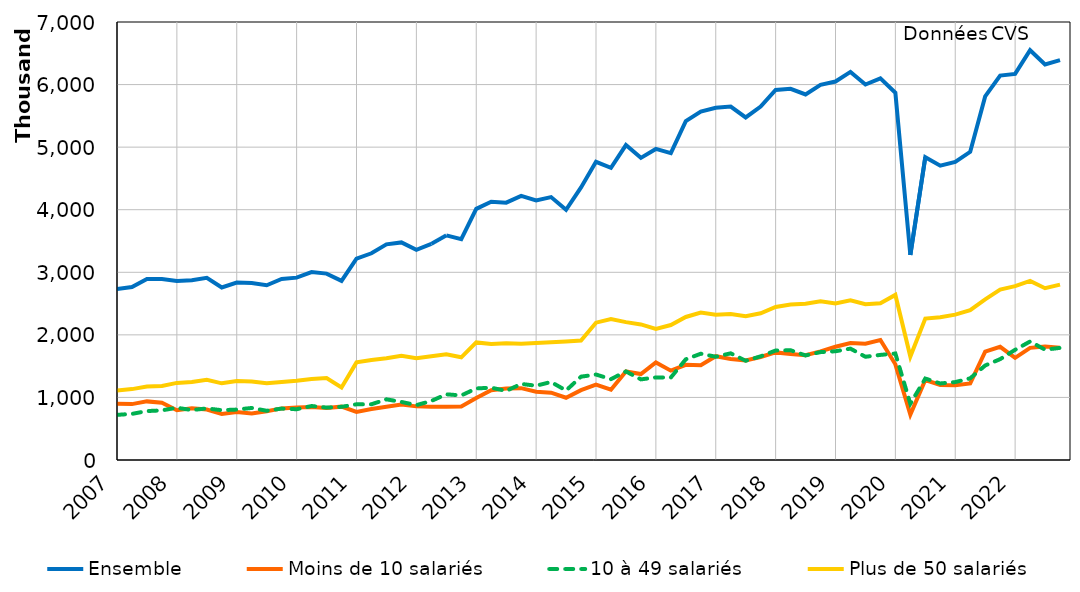
| Category | Ensemble | Moins de 10 salariés | 10 à 49 salariés | Plus de 50 salariés |
|---|---|---|---|---|
| 2007-01-01 | 2732173 | 899910 | 721403 | 1110859 |
| 2007-04-01 | 2763568 | 893427 | 737051 | 1133090 |
| 2007-07-01 | 2892276 | 936686 | 781789 | 1173800 |
| 2007-10-01 | 2892066 | 915352 | 793323 | 1183391 |
| 2008-01-01 | 2862612 | 795141 | 835026 | 1232445 |
| 2008-04-01 | 2871384 | 826577 | 798074 | 1246733 |
| 2008-07-01 | 2912470 | 805627 | 824195 | 1282648 |
| 2008-10-01 | 2757917 | 736533 | 796007 | 1225377 |
| 2009-01-01 | 2834828 | 766598 | 806085 | 1262144 |
| 2009-04-01 | 2828780 | 743368 | 831855 | 1253557 |
| 2009-07-01 | 2792769 | 780034 | 786946 | 1225789 |
| 2009-10-01 | 2894340 | 824590 | 821611 | 1248139 |
| 2010-01-01 | 2914322 | 837217 | 811510 | 1265595 |
| 2010-04-01 | 3002741 | 846842 | 862668 | 1293231 |
| 2010-07-01 | 2978815 | 832173 | 837594 | 1309047 |
| 2010-10-01 | 2862588 | 852887 | 850040 | 1159661 |
| 2011-01-01 | 3218928 | 768588 | 890356 | 1559984 |
| 2011-04-01 | 3303790 | 813590 | 890554 | 1599646 |
| 2011-07-01 | 3447120 | 852443 | 969723 | 1624954 |
| 2011-10-01 | 3477615 | 885080 | 928043 | 1664492 |
| 2012-01-01 | 3358972 | 856984 | 876964 | 1625024 |
| 2012-04-01 | 3454054 | 852094 | 943933 | 1658027 |
| 2012-07-01 | 3590505 | 850554 | 1050081 | 1689870 |
| 2012-10-01 | 3528094 | 855264 | 1031404 | 1641426 |
| 2013-01-01 | 4013410 | 990559 | 1143377 | 1879474 |
| 2013-04-01 | 4126765 | 1115842 | 1155878 | 1855045 |
| 2013-07-01 | 4112420 | 1142009 | 1104196 | 1866214 |
| 2013-10-01 | 4221286 | 1147868 | 1215757 | 1857662 |
| 2014-01-01 | 4147546 | 1091200 | 1187499 | 1868848 |
| 2014-04-01 | 4202389 | 1075541 | 1246668 | 1880180 |
| 2014-07-01 | 3997805 | 994688 | 1110521 | 1892595 |
| 2014-10-01 | 4355377 | 1115521 | 1331903 | 1907954 |
| 2015-01-01 | 4765850 | 1205200 | 1365923 | 2194727 |
| 2015-04-01 | 4668917 | 1122794 | 1292168 | 2253954 |
| 2015-07-01 | 5033625 | 1415241 | 1415089 | 2203295 |
| 2015-10-01 | 4828947 | 1373908 | 1288626 | 2166413 |
| 2016-01-01 | 4971504 | 1558587 | 1319190 | 2093727 |
| 2016-04-01 | 4904024 | 1428259 | 1318646 | 2157119 |
| 2016-07-01 | 5416817 | 1521743 | 1609353 | 2285721 |
| 2016-10-01 | 5569017 | 1514223 | 1698397 | 2356397 |
| 2017-01-01 | 5630427 | 1659057 | 1650711 | 2320658 |
| 2017-04-01 | 5649164 | 1612995 | 1704672 | 2331498 |
| 2017-07-01 | 5475133 | 1592363 | 1585765 | 2297005 |
| 2017-10-01 | 5648385 | 1646854 | 1656781 | 2344750 |
| 2018-01-01 | 5914472 | 1719616 | 1749878 | 2444977 |
| 2018-04-01 | 5931845 | 1693967 | 1753571 | 2484306 |
| 2018-07-01 | 5841588 | 1673973 | 1671152 | 2496463 |
| 2018-10-01 | 5996247 | 1735785 | 1724277 | 2536184 |
| 2019-01-01 | 6048424 | 1810472 | 1737956 | 2499995 |
| 2019-04-01 | 6202747 | 1870092 | 1779682 | 2552973 |
| 2019-07-01 | 6000425 | 1859597 | 1649940 | 2490889 |
| 2019-10-01 | 6099987 | 1916946 | 1679613 | 2503428 |
| 2020-01-01 | 5869712 | 1529147 | 1702077 | 2638488 |
| 2020-04-01 | 3277372 | 724621 | 899107 | 1653644 |
| 2020-07-01 | 4840222 | 1278460 | 1301686 | 2260075 |
| 2020-10-01 | 4704570 | 1200470 | 1223367 | 2280732 |
| 2021-01-01 | 4762562 | 1194022 | 1245215 | 2323325 |
| 2021-04-01 | 4925913 | 1224473 | 1305784 | 2395656 |
| 2021-07-01 | 5810008 | 1733591 | 1510399 | 2566018 |
| 2021-10-01 | 6144378 | 1809540 | 1611949 | 2722889 |
| 2022-01-01 | 6170980 | 1632211 | 1761128 | 2777641 |
| 2022-04-01 | 6549527 | 1792765 | 1893958 | 2862804 |
| 2022-07-01 | 6321690 | 1813238 | 1763120 | 2745332 |
| 2022-10-01 | 6390896 | 1796006 | 1791805 | 2803085 |